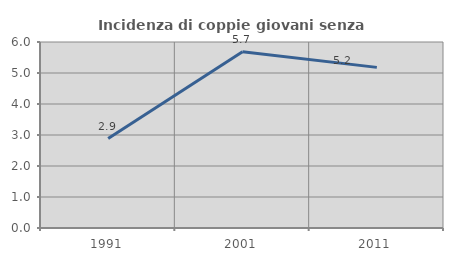
| Category | Incidenza di coppie giovani senza figli |
|---|---|
| 1991.0 | 2.885 |
| 2001.0 | 5.684 |
| 2011.0 | 5.181 |